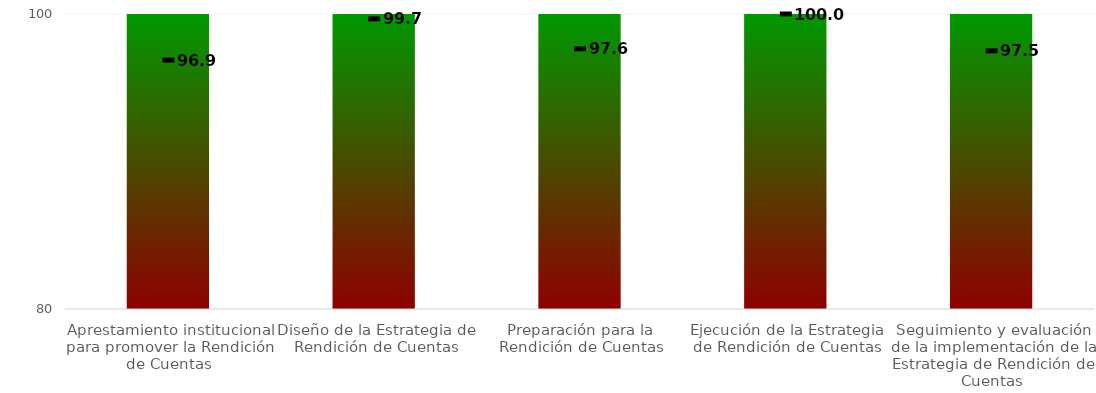
| Category | Rangos |
|---|---|
| Aprestamiento institucional para promover la Rendición de Cuentas | 100 |
| Diseño de la Estrategia de Rendición de Cuentas | 100 |
| Preparación para la Rendición de Cuentas | 100 |
| Ejecución de la Estrategia de Rendición de Cuentas | 100 |
| Seguimiento y evaluación de la implementación de la Estrategia de Rendición de Cuentas | 100 |